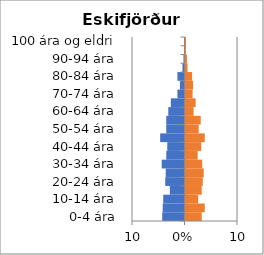
| Category | % karlar | %konur |
|---|---|---|
| 0-4 ára | -0.042 | 0.031 |
| 5-9 ára | -0.042 | 0.037 |
| 10-14 ára | -0.041 | 0.024 |
| 15-19 ára | -0.028 | 0.031 |
| 20-24 ára | -0.037 | 0.033 |
| 25-29 ára | -0.036 | 0.035 |
| 30-34 ára | -0.043 | 0.032 |
| 35-39 ára | -0.035 | 0.023 |
| 40-44 ára | -0.033 | 0.03 |
| 45-49 ára | -0.046 | 0.037 |
| 50-54 ára | -0.035 | 0.025 |
| 55-59 ára | -0.035 | 0.029 |
| 60-64 ára | -0.031 | 0.015 |
| 65-69 ára | -0.026 | 0.019 |
| 70-74 ára | -0.014 | 0.014 |
| 75-79 ára | -0.009 | 0.014 |
| 80-84 ára | -0.014 | 0.013 |
| 85-89 ára | -0.004 | 0.004 |
| 90-94 ára | -0.002 | 0.003 |
| 95-99 ára | 0 | 0.001 |
| 100 ára og eldri | 0 | 0.001 |